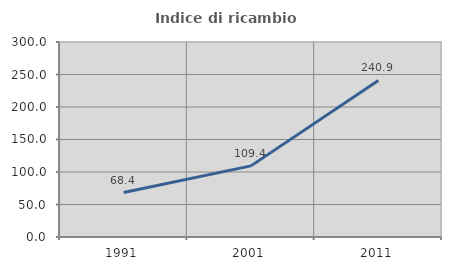
| Category | Indice di ricambio occupazionale  |
|---|---|
| 1991.0 | 68.408 |
| 2001.0 | 109.419 |
| 2011.0 | 240.87 |